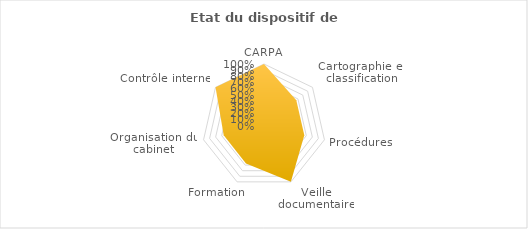
| Category | Series 1 |
|---|---|
| CARPA | 1 |
| Cartographie et classification | 0.667 |
| Procédures | 0.667 |
| Veille documentaire | 1 |
| Formation | 0.67 |
| Organisation du cabinet | 0.667 |
| Contrôle interne | 1 |